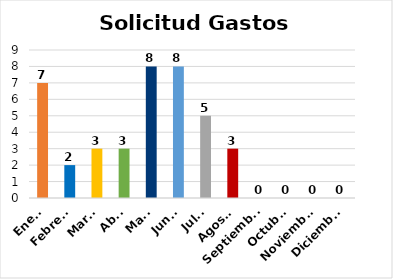
| Category | Solicitudes Gastos Menores |
|---|---|
| Enero | 7 |
| Febrero | 2 |
| Marzo | 3 |
| Abril | 3 |
| Mayo | 8 |
| Junio | 8 |
| Julio | 5 |
| Agosto | 3 |
| Septiembre | 0 |
| Octubre | 0 |
| Noviembre | 0 |
| Diciembre | 0 |